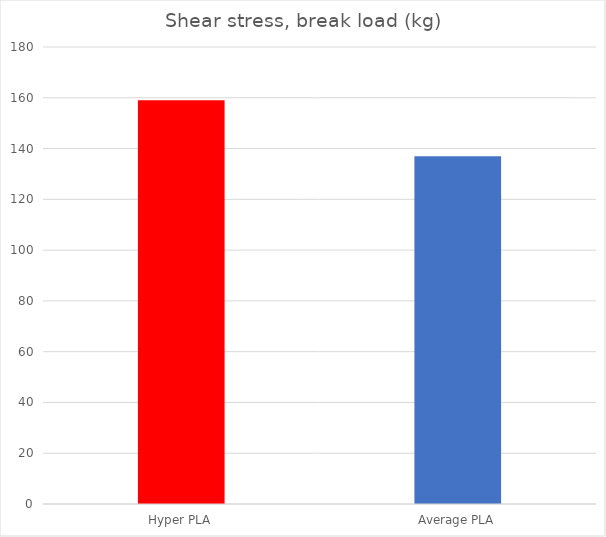
| Category | Break kg |
|---|---|
| Hyper PLA | 159 |
| Average PLA | 137 |